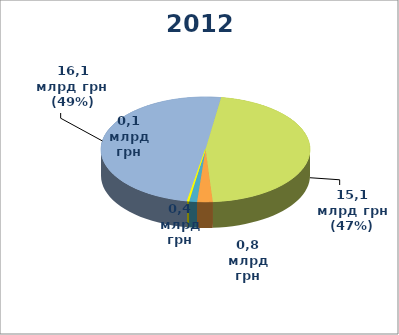
| Category | Series 0 |
|---|---|
| Складське господарство та допоміжна діяльність, 16,1 млрд грн | 16077.6 |
| Наземний і трубопровідний транспорт, 15,1 млрд грн | 15076.9 |
| Авіаційний транспорт, 0,8 млрд грн | 774.3 |
| Поштова та кур’єрська діяльність, 0,4 млрд грн | 385.5 |
| Водний транспорт, 0,1 млрд грн | 98.7 |